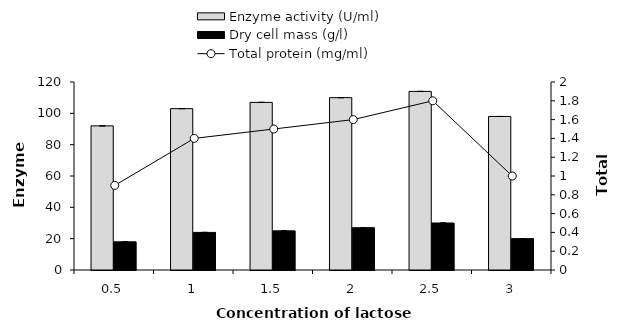
| Category | Enzyme activity (U/ml) | Dry cell mass (g/l) |
|---|---|---|
| 0.5 | 92 | 18 |
| 1.0 | 103 | 24 |
| 1.5 | 107 | 25 |
| 2.0 | 110 | 27 |
| 2.5 | 114 | 30 |
| 3.0 | 98 | 20 |